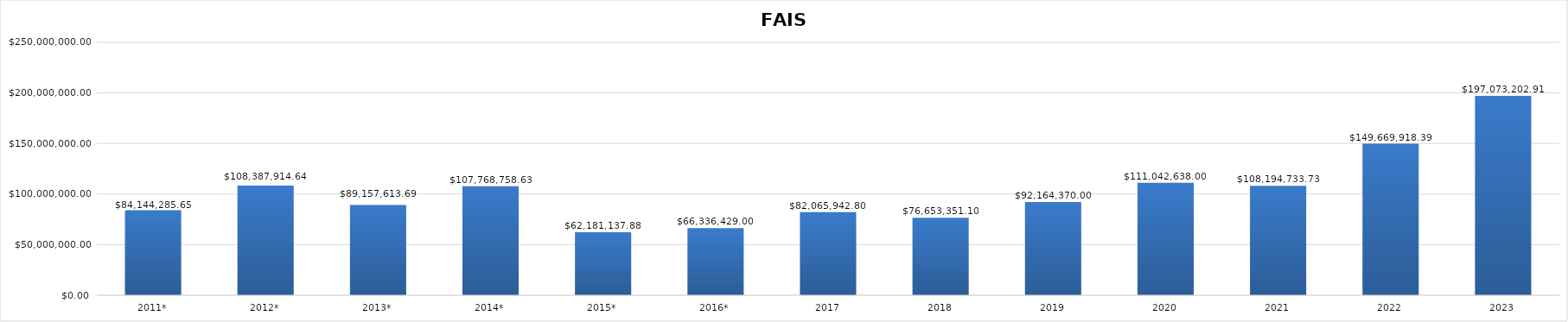
| Category | FAISM |
|---|---|
| 2011* | 84144285.646 |
| 2012* | 108387914.64 |
| 2013* | 89157613.688 |
| 2014* | 107768758.625 |
| 2015* | 62181137.88 |
| 2016* | 66336429 |
| 2017 | 82065942.8 |
| 2018 | 76653351.1 |
| 2019 | 92164370 |
| 2020 | 111042638 |
| 2021 | 108194733.73 |
| 2022 | 149669918.39 |
| 2023 | 197073202.91 |